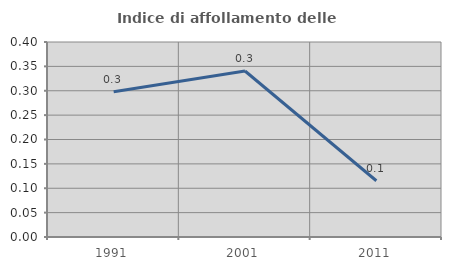
| Category | Indice di affollamento delle abitazioni  |
|---|---|
| 1991.0 | 0.298 |
| 2001.0 | 0.341 |
| 2011.0 | 0.115 |